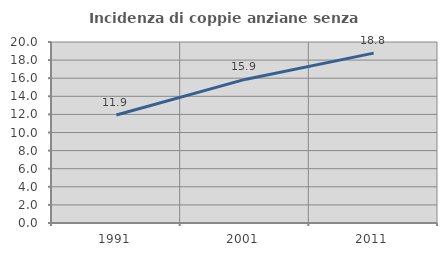
| Category | Incidenza di coppie anziane senza figli  |
|---|---|
| 1991.0 | 11.935 |
| 2001.0 | 15.865 |
| 2011.0 | 18.769 |